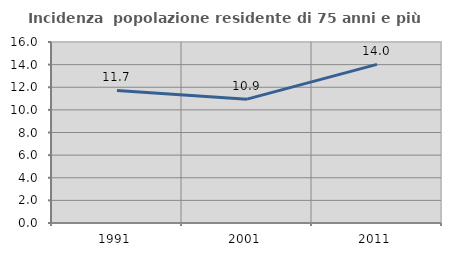
| Category | Incidenza  popolazione residente di 75 anni e più |
|---|---|
| 1991.0 | 11.717 |
| 2001.0 | 10.947 |
| 2011.0 | 14.019 |